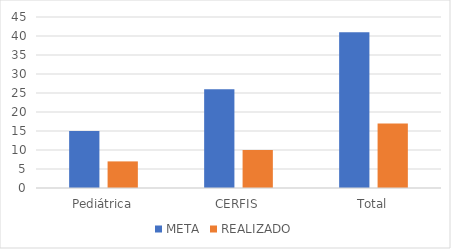
| Category | META | REALIZADO |
|---|---|---|
| Pediátrica | 15 | 7 |
| CERFIS | 26 | 10 |
| Total | 41 | 17 |